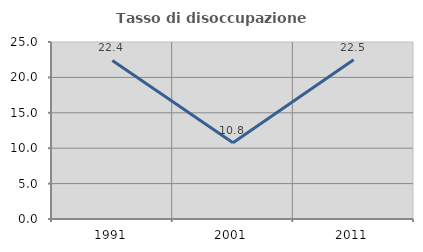
| Category | Tasso di disoccupazione giovanile  |
|---|---|
| 1991.0 | 22.393 |
| 2001.0 | 10.762 |
| 2011.0 | 22.507 |